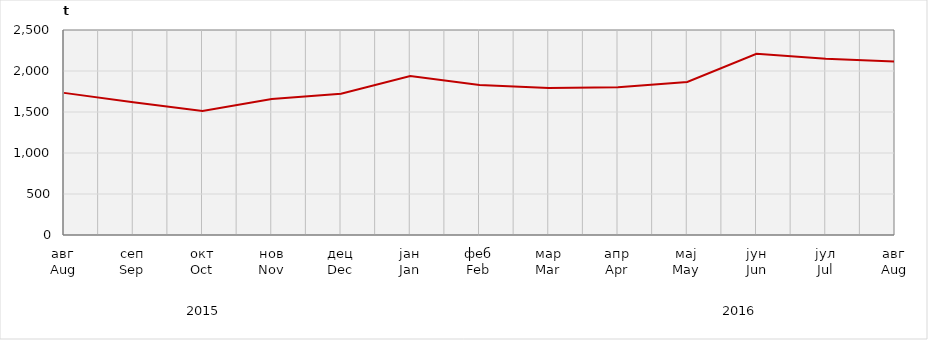
| Category | Нето тежина заклане стоке                              Net weight of  slaughtered livestock |
|---|---|
| авг
Aug | 1733294.8 |
| сеп
Sep | 1619599 |
| окт
Oct | 1511667.7 |
| нов
Nov | 1658700 |
| дец
Dec | 1721996.5 |
| јан
Jan | 1938649.7 |
| феб
Feb | 1828587.85 |
| мар
Mar | 1792740.7 |
| апр
Apr | 1800600 |
| мај
May | 1866665 |
| јун
Jun | 2210576.92 |
| јул
Jul | 2148617 |
| авг
Aug | 2114109.78 |